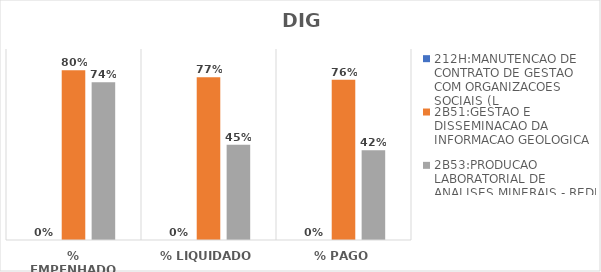
| Category | 212H:MANUTENCAO DE CONTRATO DE GESTAO COM ORGANIZACOES SOCIAIS (L | 2B51:GESTAO E DISSEMINACAO DA INFORMACAO GEOLOGICA | 2B53:PRODUCAO LABORATORIAL DE ANALISES MINERAIS - REDE LAMIN |
|---|---|---|---|
| % EMPENHADO | 0 | 0.8 | 0.744 |
| % LIQUIDADO | 0 | 0.766 | 0.449 |
| % PAGO | 0 | 0.756 | 0.423 |